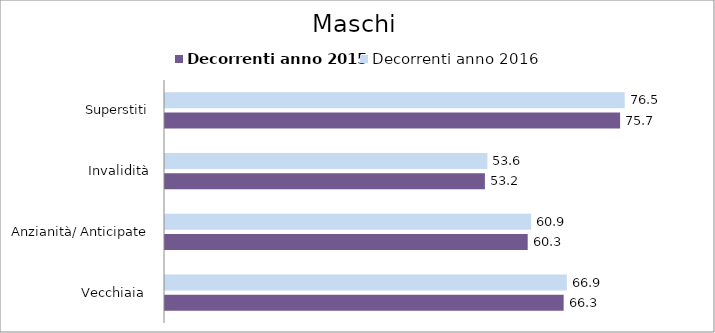
| Category | Decorrenti anno 2015 | Decorrenti anno 2016 |
|---|---|---|
| Vecchiaia  | 66.32 | 66.85 |
| Anzianità/ Anticipate | 60.34 | 60.91 |
| Invalidità | 53.22 | 53.64 |
| Superstiti | 75.71 | 76.48 |